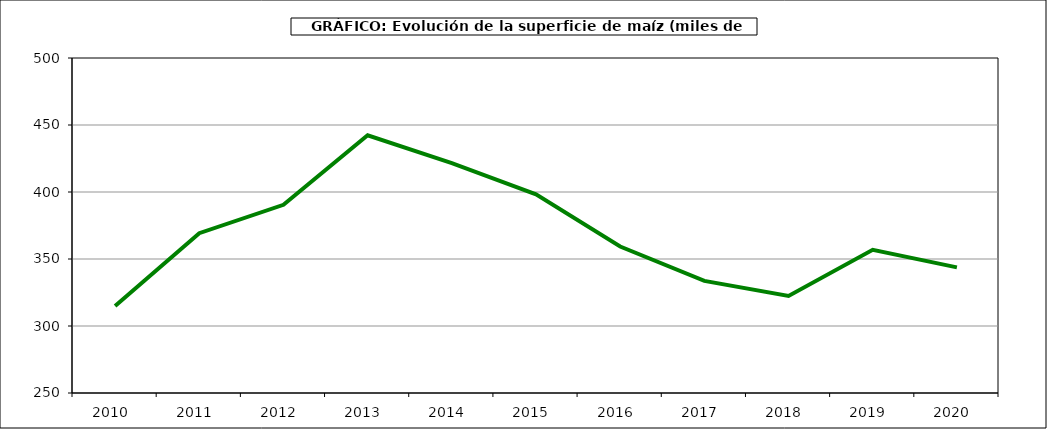
| Category | Superficie |
|---|---|
| 2010.0 | 314.99 |
| 2011.0 | 369.264 |
| 2012.0 | 390.433 |
| 2013.0 | 442.298 |
| 2014.0 | 421.605 |
| 2015.0 | 398.257 |
| 2016.0 | 359.275 |
| 2017.0 | 333.628 |
| 2018.0 | 322.373 |
| 2019.0 | 356.825 |
| 2020.0 | 343.778 |